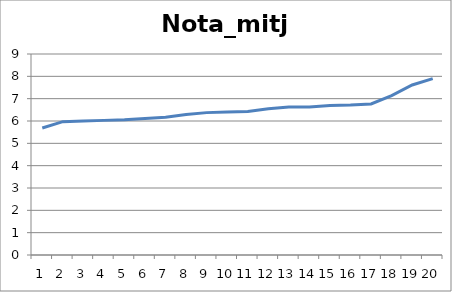
| Category | Nota_mitja |
|---|---|
| 0 | 5.688 |
| 1 | 5.97 |
| 2 | 5.995 |
| 3 | 6.028 |
| 4 | 6.055 |
| 5 | 6.114 |
| 6 | 6.168 |
| 7 | 6.289 |
| 8 | 6.375 |
| 9 | 6.408 |
| 10 | 6.425 |
| 11 | 6.551 |
| 12 | 6.623 |
| 13 | 6.63 |
| 14 | 6.696 |
| 15 | 6.713 |
| 16 | 6.765 |
| 17 | 7.133 |
| 18 | 7.613 |
| 19 | 7.897 |